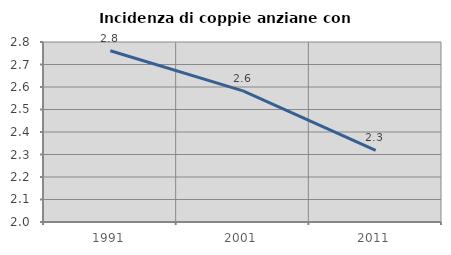
| Category | Incidenza di coppie anziane con figli |
|---|---|
| 1991.0 | 2.761 |
| 2001.0 | 2.583 |
| 2011.0 | 2.318 |